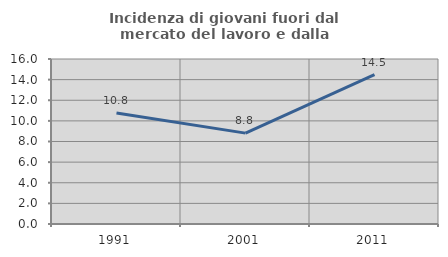
| Category | Incidenza di giovani fuori dal mercato del lavoro e dalla formazione  |
|---|---|
| 1991.0 | 10.757 |
| 2001.0 | 8.812 |
| 2011.0 | 14.49 |